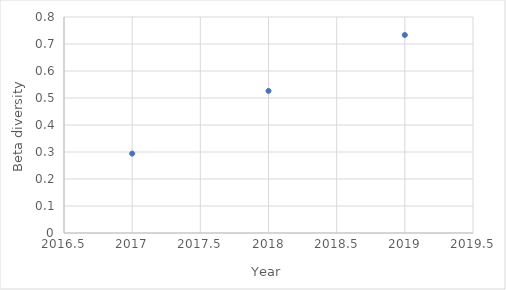
| Category | Beta div. |
|---|---|
| 2017.0 | 0.294 |
| 2018.0 | 0.526 |
| 2019.0 | 0.733 |